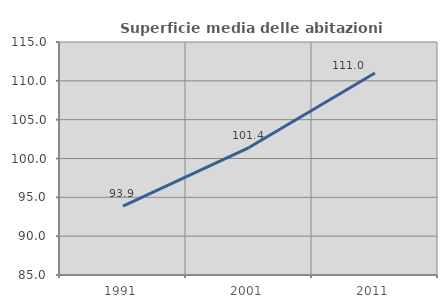
| Category | Superficie media delle abitazioni occupate |
|---|---|
| 1991.0 | 93.877 |
| 2001.0 | 101.407 |
| 2011.0 | 111.006 |